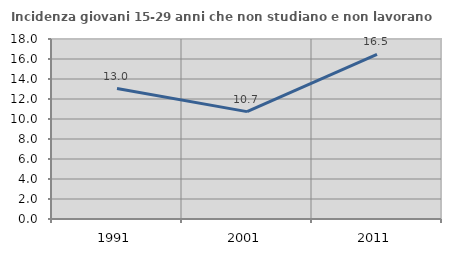
| Category | Incidenza giovani 15-29 anni che non studiano e non lavorano  |
|---|---|
| 1991.0 | 13.048 |
| 2001.0 | 10.738 |
| 2011.0 | 16.471 |